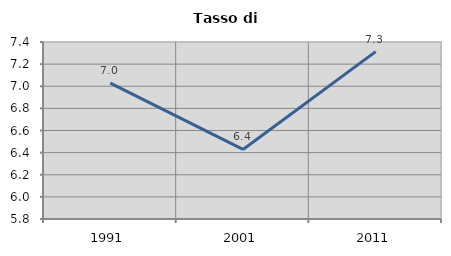
| Category | Tasso di disoccupazione   |
|---|---|
| 1991.0 | 7.029 |
| 2001.0 | 6.429 |
| 2011.0 | 7.313 |